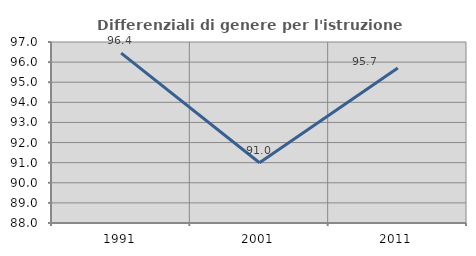
| Category | Differenziali di genere per l'istruzione superiore |
|---|---|
| 1991.0 | 96.448 |
| 2001.0 | 90.998 |
| 2011.0 | 95.703 |